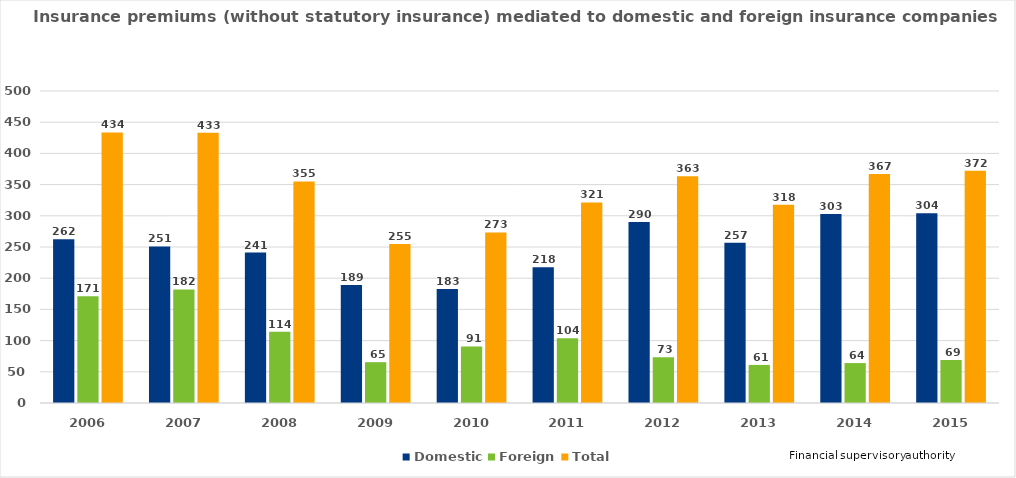
| Category | Domestic | Foreign | Total |
|---|---|---|---|
| 2006.0 | 262.471 | 171.056 | 433.526 |
| 2007.0 | 251 | 182 | 433 |
| 2008.0 | 241 | 114 | 355 |
| 2009.0 | 189.249 | 65.417 | 254.666 |
| 2010.0 | 182.562 | 90.729 | 273.291 |
| 2011.0 | 217.55 | 103.894 | 321.444 |
| 2012.0 | 289.922 | 73.321 | 363.243 |
| 2013.0 | 257 | 61 | 317.523 |
| 2014.0 | 303 | 64 | 367 |
| 2015.0 | 304 | 69 | 372 |